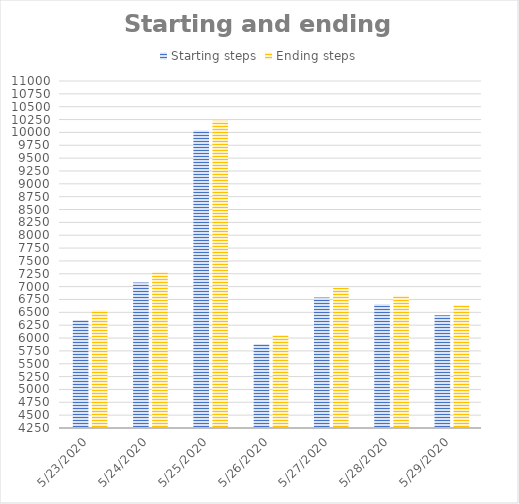
| Category | Starting steps | Ending steps |
|---|---|---|
| 5/23/20 | 6352 | 6540 |
| 5/24/20 | 7079 | 7279 |
| 5/25/20 | 10038 | 10228 |
| 5/26/20 | 5886 | 6060 |
| 5/27/20 | 6789 | 6972 |
| 5/28/20 | 6657 | 6823 |
| 5/29/20 | 6442 | 6645 |